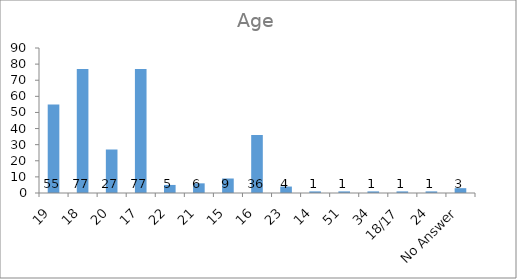
| Category | Age |
|---|---|
| 19 | 55 |
| 18 | 77 |
| 20 | 27 |
| 17 | 77 |
| 22 | 5 |
| 21 | 6 |
| 15 | 9 |
| 16 | 36 |
| 23 | 4 |
| 14 | 1 |
| 51 | 1 |
| 34 | 1 |
| 18/17 | 1 |
| 24 | 1 |
| No Answer | 3 |